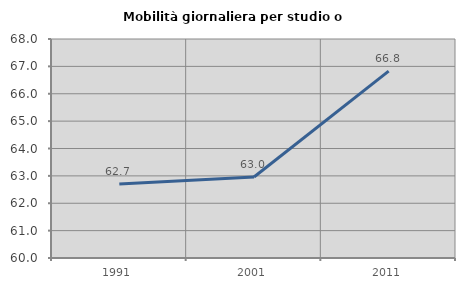
| Category | Mobilità giornaliera per studio o lavoro |
|---|---|
| 1991.0 | 62.705 |
| 2001.0 | 62.959 |
| 2011.0 | 66.829 |